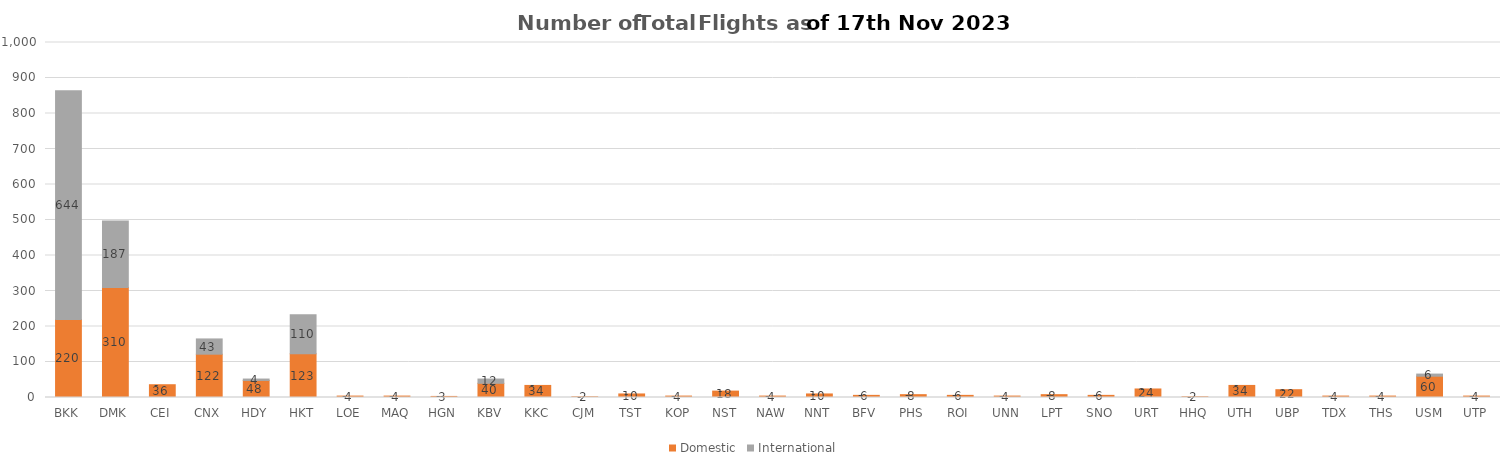
| Category | Domestic | International |
|---|---|---|
| BKK | 220 | 644 |
| DMK | 310 | 187 |
| CEI | 36 | 0 |
| CNX | 122 | 43 |
| HDY | 48 | 4 |
| HKT | 123 | 110 |
| LOE | 4 | 0 |
| MAQ | 4 | 0 |
| HGN | 3 | 0 |
| KBV | 40 | 12 |
| KKC | 34 | 0 |
| CJM | 2 | 0 |
| TST | 10 | 0 |
| KOP | 4 | 0 |
| NST | 18 | 0 |
| NAW | 4 | 0 |
| NNT | 10 | 0 |
| BFV | 6 | 0 |
| PHS | 8 | 0 |
| ROI | 6 | 0 |
| UNN | 4 | 0 |
| LPT | 8 | 0 |
| SNO | 6 | 0 |
| URT | 24 | 0 |
| HHQ | 2 | 0 |
| UTH | 34 | 0 |
| UBP | 22 | 0 |
| TDX | 4 | 0 |
| THS | 4 | 0 |
| USM | 60 | 6 |
| UTP | 4 | 0 |